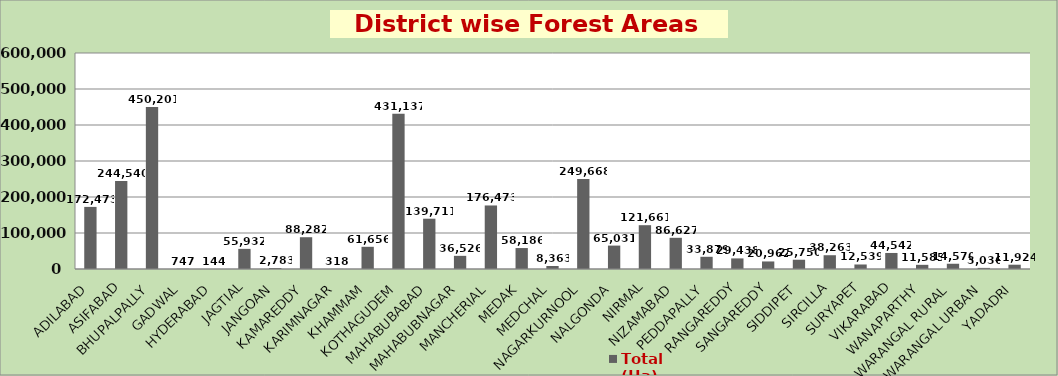
| Category | Total (Ha) |
|---|---|
| ADILABAD | 172473.11 |
| ASIFABAD | 244539.99 |
| BHUPALPALLY | 450201.45 |
| GADWAL | 746.97 |
| HYDERABAD | 143.83 |
| JAGTIAL | 55932.33 |
| JANGOAN | 2783.28 |
| KAMAREDDY | 88281.65 |
| KARIMNAGAR | 318.37 |
| KHAMMAM | 61656.12 |
| KOTHAGUDEM | 431136.97 |
| MAHABUBABAD | 139710.58 |
| MAHABUBNAGAR | 36526.04 |
| MANCHERIAL | 176473.35 |
| MEDAK | 58186.07 |
| MEDCHAL | 8363.23 |
| NAGARKURNOOL | 249668.22 |
| NALGONDA | 65030.62 |
| NIRMAL | 121660.54 |
| NIZAMABAD | 86626.99 |
| PEDDAPALLY | 33879.4 |
| RANGAREDDY | 29438.04 |
| SANGAREDDY | 20962.11 |
| SIDDIPET | 25750.01 |
| SIRCILLA | 38263.03 |
| SURYAPET | 12539.33 |
| VIKARABAD | 44542.15 |
| WANAPARTHY | 11584.73 |
| WARANGAL RURAL | 14569.87 |
| WARANGAL URBAN | 3035.84 |
| YADADRI | 11924.33 |